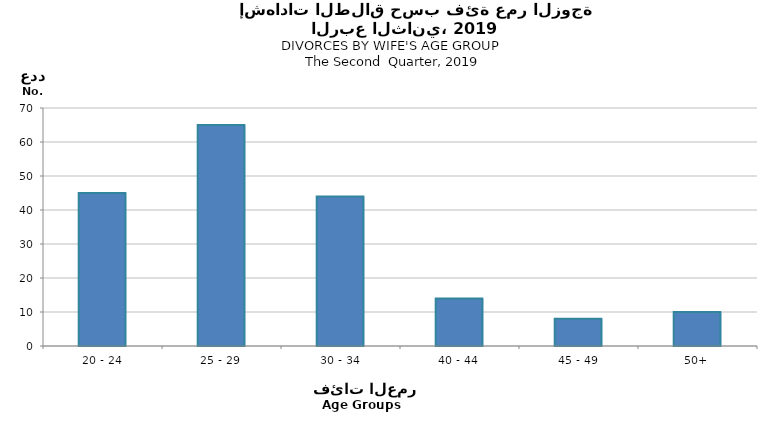
| Category | Series 0 |
|---|---|
| 20 - 24 | 45 |
| 25 - 29 | 65 |
| 30 - 34 | 44 |
| 40 - 44 | 14 |
| 45 - 49 | 8 |
| 50+ | 10 |